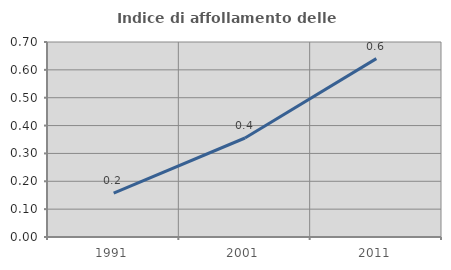
| Category | Indice di affollamento delle abitazioni  |
|---|---|
| 1991.0 | 0.158 |
| 2001.0 | 0.355 |
| 2011.0 | 0.64 |